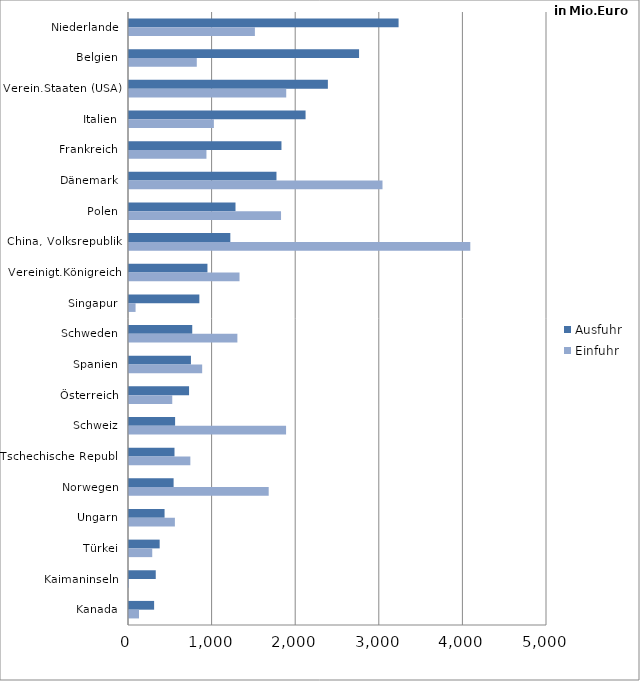
| Category | Ausfuhr | Einfuhr |
|---|---|---|
| Niederlande | 3224.621 | 1505.896 |
| Belgien | 2751.954 | 810.884 |
| Verein.Staaten (USA) | 2378.879 | 1880.75 |
| Italien | 2112.03 | 1015.188 |
| Frankreich | 1823.727 | 926.45 |
| Dänemark | 1763.987 | 3032.387 |
| Polen | 1273.87 | 1818.639 |
| China, Volksrepublik | 1212.094 | 4082.587 |
| Vereinigt.Königreich | 938.32 | 1321.97 |
| Singapur | 841.553 | 78.544 |
| Schweden | 756.551 | 1296.421 |
| Spanien | 740.967 | 875.329 |
| Österreich | 718.479 | 517.454 |
| Schweiz | 551.513 | 1878.836 |
| Tschechische Republ. | 544.268 | 733.824 |
| Norwegen | 533.542 | 1671.032 |
| Ungarn | 425.423 | 548.887 |
| Türkei | 366.819 | 278.04 |
| Kaimaninseln | 320.005 | 0.019 |
| Kanada | 300.474 | 119.491 |